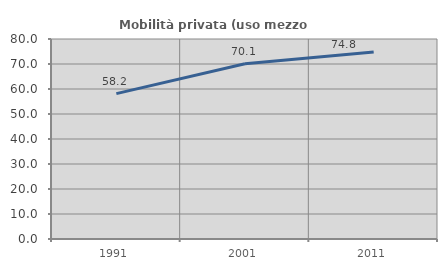
| Category | Mobilità privata (uso mezzo privato) |
|---|---|
| 1991.0 | 58.157 |
| 2001.0 | 70.131 |
| 2011.0 | 74.828 |